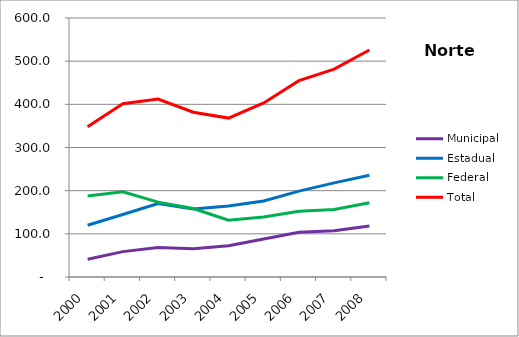
| Category | Municipal | Estadual | Federal | Total |
|---|---|---|---|---|
| 2000.0 | 41 | 119.8 | 187.4 | 348.2 |
| 2001.0 | 58.8 | 144.9 | 197.5 | 401.3 |
| 2002.0 | 68.3 | 170.4 | 173.4 | 412.1 |
| 2003.0 | 65.6 | 157.3 | 158.7 | 381.6 |
| 2004.0 | 72.2 | 164.4 | 131.5 | 368.1 |
| 2005.0 | 87.9 | 176.1 | 139.1 | 403.1 |
| 2006.0 | 103.7 | 199 | 152.1 | 454.8 |
| 2007.0 | 106.9 | 218 | 156.6 | 481.5 |
| 2008.0 | 118.3 | 235.6 | 171.9 | 525.8 |